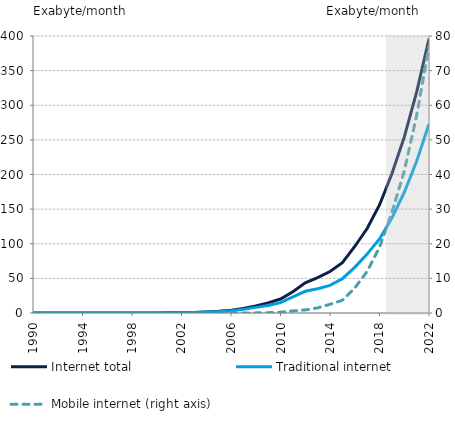
| Category | Internet total | Traditional internet |
|---|---|---|
| 1990-01-01 | 0 | 0 |
| 1991-01-01 | 0 | 0 |
| 1992-01-01 | 0 | 0 |
| 1993-01-01 | 0 | 0 |
| 1994-01-01 | 0 | 0 |
| 1995-01-01 | 0 | 0 |
| 1996-01-01 | 0.002 | 0.002 |
| 1997-01-01 | 0.005 | 0.005 |
| 1998-01-01 | 0.012 | 0.011 |
| 1999-01-01 | 0.028 | 0.026 |
| 2000-01-01 | 0.084 | 0.075 |
| 2001-01-01 | 0.197 | 0.175 |
| 2002-01-01 | 0.405 | 0.356 |
| 2003-01-01 | 0.784 | 0.681 |
| 2004-01-01 | 1.477 | 1.267 |
| 2005-01-01 | 2.426 | 2.055 |
| 2006-01-01 | 3.992 | 3.339 |
| 2007-01-01 | 6.43 | 5.219 |
| 2008-01-01 | 10.174 | 8.14 |
| 2009-01-01 | 14.686 | 10.942 |
| 2010-01-01 | 20.151 | 14.955 |
| 2011-01-01 | 30.734 | 23.288 |
| 2012-01-01 | 43.57 | 31.339 |
| 2013-01-01 | 51.168 | 34.952 |
| 2014-01-01 | 59.848 | 39.909 |
| 2015-01-01 | 72.521 | 49.494 |
| 2016-01-01 | 96.054 | 65.942 |
| 2017-01-01 | 122 | 85 |
| 2018-01-01 | 156 | 107 |
| 2019-01-01 | 201 | 137 |
| 2020-01-01 | 254 | 174 |
| 2021-01-01 | 319 | 219 |
| 2022-01-01 | 396 | 273 |